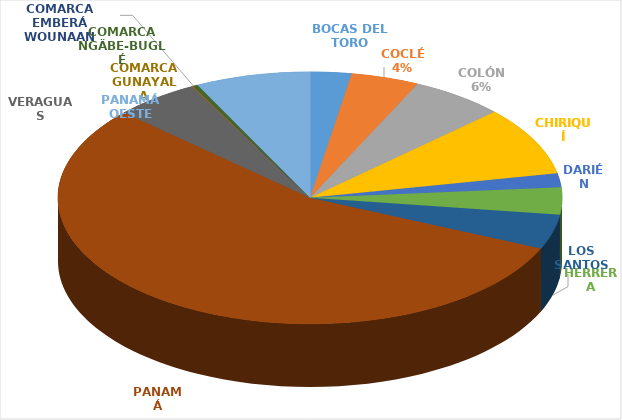
| Category | Cantidad  |
|---|---|
| BOCAS DEL TORO | 150 |
| COCLÉ | 248 |
| COLÓN | 342 |
| CHIRIQUÍ | 501 |
| DARIÉN | 101 |
| HERRERA | 199 |
| LOS SANTOS | 252 |
| PANAMÁ | 3133 |
| VERAGUAS | 309 |
| COMARCA GUNAYALA | 6 |
| COMARCA EMBERÁ WOUNAAN | 1 |
| COMARCA NGÄBE-BUGLÉ | 16 |
| PANAMÁ OESTE | 417 |